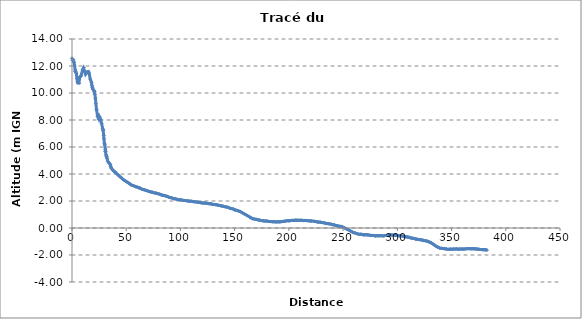
| Category | Series 0 |
|---|---|
| 0.0 | 12.573 |
| 0.3375396271672209 | 12.436 |
| 1.1967810991138275 | 12.478 |
| 1.7707992544836415 | 12.296 |
| 2.3601868571436144 | 12.067 |
| 2.9404293905788235 | 11.711 |
| 3.1366877430658087 | 11.605 |
| 3.152764184036816 | 11.601 |
| 4.00160967573241 | 11.465 |
| 4.579277781140222 | 11.064 |
| 5.121447158715749 | 10.835 |
| 5.298488275215495 | 10.757 |
| 6.5151277806709285 | 10.749 |
| 6.596293808076005 | 10.971 |
| 7.3044592545565985 | 11.194 |
| 8.268518730963631 | 11.262 |
| 9.819227056757175 | 11.724 |
| 10.543451285116296 | 11.845 |
| 10.894803256309814 | 11.872 |
| 11.722458487408183 | 11.604 |
| 12.497890381979428 | 11.391 |
| 13.879947297718054 | 11.559 |
| 15.017456142899823 | 11.591 |
| 15.763076983721733 | 11.469 |
| 16.803216180046174 | 11.029 |
| 17.94270938256309 | 10.802 |
| 18.356736964716326 | 10.566 |
| 18.80087620279036 | 10.41 |
| 19.085693280778283 | 10.304 |
| 20.297948911007797 | 10.172 |
| 20.681943743473276 | 10.122 |
| 21.07681427559751 | 9.901 |
| 21.57827548697144 | 9.609 |
| 22.03891977816196 | 9.209 |
| 22.61360919891804 | 8.777 |
| 23.625655970010623 | 8.262 |
| 24.61432714915345 | 8.094 |
| 24.637046941321643 | 8.069 |
| 25.194631907930518 | 8.255 |
| 26.490866425715375 | 8.04 |
| 27.289719272859163 | 7.734 |
| 28.23556213331476 | 7.383 |
| 28.66290998832607 | 7.24 |
| 28.74991862575816 | 7.244 |
| 29.25223153841402 | 6.855 |
| 29.428963046559417 | 6.605 |
| 29.89197648195144 | 6.278 |
| 30.053983595898373 | 6.224 |
| 30.185116149907746 | 6.162 |
| 30.72184403674534 | 5.834 |
| 30.864095968800417 | 5.666 |
| 30.874508141995566 | 5.663 |
| 31.4170849378077 | 5.416 |
| 31.855527510516634 | 5.312 |
| 31.98048511227787 | 5.301 |
| 32.30478534227504 | 5.155 |
| 33.172785246555996 | 4.919 |
| 34.28444056698917 | 4.811 |
| 35.2587845503797 | 4.708 |
| 35.66874549195251 | 4.544 |
| 36.333813686566806 | 4.431 |
| 37.79384115157414 | 4.276 |
| 39.03644211516155 | 4.186 |
| 39.190132444375365 | 4.163 |
| 40.837779812493 | 4.051 |
| 42.25805950337431 | 3.949 |
| 43.61724635926826 | 3.855 |
| 44.7713789043463 | 3.764 |
| 46.04881221036771 | 3.674 |
| 47.34266102580579 | 3.59 |
| 48.50459064848282 | 3.514 |
| 49.889559038111756 | 3.451 |
| 51.29576923067541 | 3.38 |
| 52.40229022672192 | 3.316 |
| 53.584755527606355 | 3.257 |
| 54.853728569487856 | 3.175 |
| 56.15482434273273 | 3.146 |
| 57.62492499793884 | 3.095 |
| 58.9062356715553 | 3.052 |
| 60.128207822715225 | 3.031 |
| 61.37956106917591 | 2.984 |
| 62.64124948457811 | 2.959 |
| 64.09609586410555 | 2.89 |
| 65.39228967561658 | 2.854 |
| 66.60870696850905 | 2.828 |
| 68.06708696543676 | 2.792 |
| 69.4521995401162 | 2.757 |
| 70.96037878278658 | 2.711 |
| 72.36106273405713 | 2.676 |
| 73.74345625911809 | 2.662 |
| 75.10628704030384 | 2.621 |
| 76.62587689561961 | 2.592 |
| 77.9988704080465 | 2.572 |
| 79.37455840497847 | 2.539 |
| 80.8771722180211 | 2.504 |
| 82.35743843116072 | 2.451 |
| 83.74068822824458 | 2.427 |
| 85.10865760922829 | 2.402 |
| 86.48250878019762 | 2.371 |
| 87.86351421349337 | 2.342 |
| 89.20163795013289 | 2.285 |
| 90.32981003556166 | 2.263 |
| 91.47228477506276 | 2.237 |
| 92.85050089811712 | 2.203 |
| 94.00101005832002 | 2.174 |
| 94.33354033447716 | 2.178 |
| 95.73958872904511 | 2.154 |
| 97.26674565374562 | 2.113 |
| 98.72559969943424 | 2.099 |
| 100.1279233628992 | 2.087 |
| 101.60402615007574 | 2.064 |
| 103.04389618481375 | 2.04 |
| 104.50822792985583 | 2.035 |
| 106.02470363561241 | 2.012 |
| 107.5059422541886 | 1.998 |
| 108.88491624612968 | 1.981 |
| 110.3445321207074 | 1.98 |
| 111.79306365768765 | 1.953 |
| 113.284294697228 | 1.94 |
| 114.78545413505407 | 1.927 |
| 116.1722392480097 | 1.911 |
| 117.47586356753617 | 1.893 |
| 118.56032827228094 | 1.877 |
| 119.9976980486765 | 1.857 |
| 121.25039825069271 | 1.843 |
| 122.65025094551723 | 1.853 |
| 124.00866501942926 | 1.829 |
| 126.03614339159117 | 1.805 |
| 127.15918075412758 | 1.805 |
| 128.12003734415987 | 1.792 |
| 128.62521698682139 | 1.779 |
| 129.93362725973117 | 1.751 |
| 131.51953673848257 | 1.734 |
| 133.0575509318841 | 1.722 |
| 134.5903291102261 | 1.695 |
| 136.1277384849553 | 1.669 |
| 137.6424198859975 | 1.635 |
| 139.17040807968274 | 1.62 |
| 140.73866512112394 | 1.583 |
| 142.3032435502176 | 1.559 |
| 143.87661886866957 | 1.53 |
| 145.49413506417 | 1.468 |
| 147.04271258742207 | 1.438 |
| 148.59836199622492 | 1.411 |
| 150.2126661107201 | 1.339 |
| 151.77712937019166 | 1.31 |
| 153.37969996042906 | 1.268 |
| 154.93910211721442 | 1.228 |
| 156.56543205984443 | 1.151 |
| 158.2414722661567 | 1.072 |
| 159.919797789412 | 0.999 |
| 161.49725808190834 | 0.921 |
| 163.20231605234062 | 0.853 |
| 164.44727432850266 | 0.783 |
| 164.75412332629978 | 0.764 |
| 166.5740178444748 | 0.69 |
| 168.26428285248164 | 0.658 |
| 169.87737011430877 | 0.642 |
| 171.48844040900715 | 0.6 |
| 173.08818540008292 | 0.579 |
| 174.70637935072682 | 0.553 |
| 176.305470150871 | 0.529 |
| 177.89696638738866 | 0.517 |
| 179.37754388466388 | 0.525 |
| 180.9073820164436 | 0.492 |
| 182.37143425993523 | 0.476 |
| 183.80379369874956 | 0.474 |
| 185.26882513011006 | 0.461 |
| 186.78074189835445 | 0.464 |
| 188.27215392910878 | 0.45 |
| 189.64777025272988 | 0.46 |
| 190.97163056870724 | 0.452 |
| 192.38503685078211 | 0.463 |
| 193.79448023606022 | 0.479 |
| 195.08198092362545 | 0.493 |
| 196.47486936746103 | 0.505 |
| 197.8837013854636 | 0.539 |
| 199.30847586578344 | 0.535 |
| 200.69474409886928 | 0.537 |
| 202.08761558330437 | 0.558 |
| 203.27365624911826 | 0.566 |
| 204.67552680760397 | 0.562 |
| 205.85266442268625 | 0.577 |
| 207.0854603102516 | 0.574 |
| 208.3451841369137 | 0.569 |
| 209.56244240279582 | 0.569 |
| 210.67405353757033 | 0.564 |
| 211.96305895602072 | 0.575 |
| 213.2502781830146 | 0.547 |
| 214.54873060658147 | 0.562 |
| 215.77332045010326 | 0.557 |
| 216.79207506720374 | 0.546 |
| 216.94633555136357 | 0.548 |
| 218.5553555919198 | 0.537 |
| 220.02787497025494 | 0.51 |
| 221.0379645667804 | 0.522 |
| 223.2530161248125 | 0.494 |
| 224.6479110295844 | 0.484 |
| 226.15242897901652 | 0.446 |
| 227.4833710712364 | 0.438 |
| 228.94031300746417 | 0.433 |
| 230.34535888937316 | 0.406 |
| 231.7435619495247 | 0.392 |
| 233.28081058851734 | 0.365 |
| 234.74529122649616 | 0.329 |
| 236.08956687057636 | 0.323 |
| 237.55012365635616 | 0.303 |
| 239.09964608334448 | 0.278 |
| 240.6423254649423 | 0.242 |
| 242.06332538623263 | 0.224 |
| 243.6030392276646 | 0.176 |
| 245.06769804506496 | 0.155 |
| 246.57436198003418 | 0.128 |
| 248.03490807513157 | 0.117 |
| 249.48699503209667 | 0.071 |
| 250.85856035785636 | 0.037 |
| 252.43336321699712 | -0.044 |
| 253.97139143029327 | -0.102 |
| 255.51633044659673 | -0.163 |
| 257.01560015869256 | -0.233 |
| 258.4238459891575 | -0.295 |
| 259.4553551670996 | -0.337 |
| 259.65937630826625 | -0.342 |
| 261.32632315399195 | -0.379 |
| 262.7258349422928 | -0.414 |
| 264.2835816033284 | -0.463 |
| 265.70560567840414 | -0.465 |
| 267.06819929395505 | -0.471 |
| 268.53615450425366 | -0.504 |
| 269.99143756809383 | -0.505 |
| 271.44419056061025 | -0.502 |
| 272.81712464202826 | -0.509 |
| 274.27055166943825 | -0.531 |
| 275.60484064105196 | -0.552 |
| 276.90733465935864 | -0.546 |
| 278.25500390854097 | -0.555 |
| 279.60066223805296 | -0.587 |
| 280.75958344638485 | -0.566 |
| 282.009299477948 | -0.583 |
| 283.13966535651076 | -0.567 |
| 284.24470999666187 | -0.567 |
| 285.4163499466779 | -0.57 |
| 286.7727073645472 | -0.588 |
| 287.96810852733205 | -0.571 |
| 289.2523683308203 | -0.555 |
| 290.57106169742485 | -0.549 |
| 291.7881427837047 | -0.54 |
| 293.05032250780835 | -0.527 |
| 294.3458267973591 | -0.518 |
| 295.73572063058083 | -0.524 |
| 297.1076162153679 | -0.54 |
| 298.28579224594955 | -0.521 |
| 299.4146388537053 | -0.537 |
| 300.7742024605066 | -0.557 |
| 301.45919939531166 | -0.574 |
| 302.3142930812513 | -0.57 |
| 303.69046144014465 | -0.579 |
| 305.0778717062639 | -0.609 |
| 306.3658256036905 | -0.612 |
| 307.9190231541713 | -0.658 |
| 309.2966695199111 | -0.67 |
| 310.70236712661625 | -0.682 |
| 312.21542267603 | -0.73 |
| 313.6346597318425 | -0.752 |
| 314.8891015105195 | -0.77 |
| 315.97059312083564 | -0.79 |
| 317.11769884553377 | -0.823 |
| 318.30462204801273 | -0.832 |
| 319.7176414336351 | -0.858 |
| 321.0874642290901 | -0.864 |
| 322.44445374831366 | -0.889 |
| 323.5587880566513 | -0.904 |
| 324.2504005395773 | -0.933 |
| 326.33371499854564 | -0.953 |
| 327.53103667547896 | -0.976 |
| 328.9038330106276 | -1.017 |
| 330.12942802064987 | -1.059 |
| 331.3407877641976 | -1.107 |
| 332.69499383053284 | -1.18 |
| 334.08284839844816 | -1.248 |
| 335.5765443364086 | -1.349 |
| 336.97318115509205 | -1.398 |
| 337.0016648771742 | -1.398 |
| 339.09782862796396 | -1.486 |
| 340.6072715400435 | -1.505 |
| 342.13746707566406 | -1.52 |
| 343.61593374304096 | -1.536 |
| 345.0388298686552 | -1.55 |
| 346.4828119559026 | -1.582 |
| 347.8676800348882 | -1.58 |
| 349.17795661381825 | -1.56 |
| 350.5324232150422 | -1.572 |
| 351.94873158981954 | -1.56 |
| 353.28107975484374 | -1.564 |
| 354.64942174729174 | -1.544 |
| 355.9966518840682 | -1.572 |
| 357.27430897006747 | -1.558 |
| 358.6576852259783 | -1.559 |
| 360.1022189824415 | -1.561 |
| 361.3994942441664 | -1.563 |
| 362.868260090636 | -1.543 |
| 364.35092467041477 | -1.535 |
| 365.7166290829831 | -1.525 |
| 367.13275890339867 | -1.537 |
| 368.5141195912055 | -1.537 |
| 369.71678482042256 | -1.532 |
| 370.2639113520328 | -1.534 |
| 371.2393321359547 | -1.545 |
| 372.54628837269433 | -1.549 |
| 373.9265888402229 | -1.564 |
| 375.31490512652834 | -1.576 |
| 376.6849881063947 | -1.596 |
| 378.0312973402341 | -1.598 |
| 379.2754841136433 | -1.609 |
| 380.41350760062903 | -1.604 |
| 381.5408305173139 | -1.62 |
| 382.56250227283573 | -1.637 |